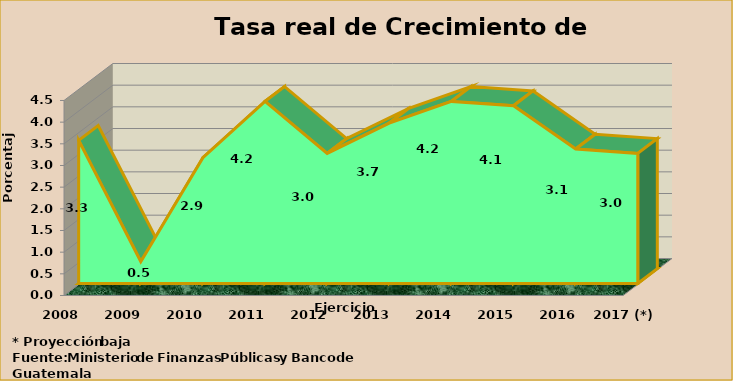
| Category | Series 0 |
|---|---|
| 2008 | 3.3 |
| 2009 | 0.5 |
| 2010 | 2.9 |
| 2011 | 4.2 |
| 2012 | 3 |
| 2013 | 3.7 |
| 2014 | 4.2 |
| 2015 | 4.1 |
| 2016 | 3.1 |
| 2017 (*) | 3 |